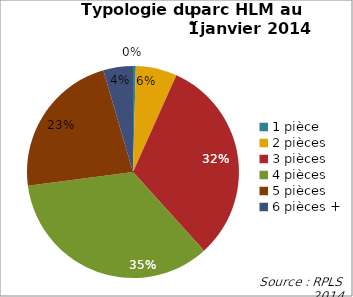
| Category | Series 0 |
|---|---|
| 1 pièce | 0.004 |
| 2 pièces | 0.063 |
| 3 pièces | 0.316 |
| 4 pièces | 0.346 |
| 5 pièces | 0.226 |
| 6 pièces + | 0.045 |